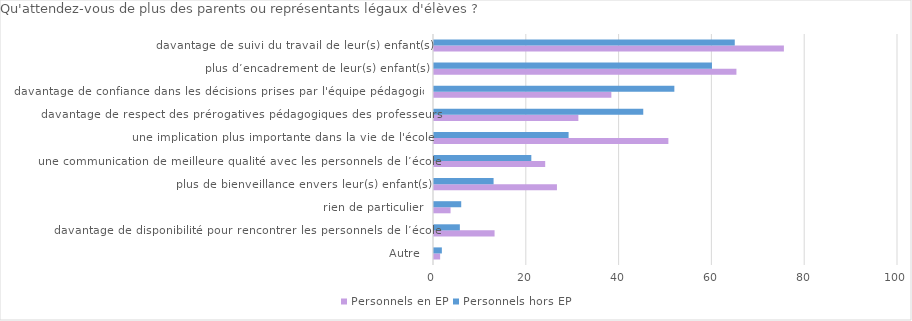
| Category | Personnels en EP | Personnels hors EP |
|---|---|---|
| Autre | 1.324 | 1.693 |
| davantage de disponibilité pour rencontrer les personnels de l’école | 13.054 | 5.572 |
| rien de particulier | 3.568 | 5.867 |
| plus de bienveillance envers leur(s) enfant(s) | 26.497 | 12.84 |
| une communication de meilleure qualité avec les personnels de l’école | 23.965 | 20.975 |
| une implication plus importante dans la vie de l'école | 50.513 | 29.007 |
| davantage de respect des prérogatives pédagogiques des professeurs | 31.115 | 45.099 |
| davantage de confiance dans les décisions prises par l'équipe pédagogique | 38.222 | 51.8 |
| plus d’encadrement de leur(s) enfant(s) | 65.178 | 59.906 |
| davantage de suivi du travail de leur(s) enfant(s) | 75.409 | 64.822 |